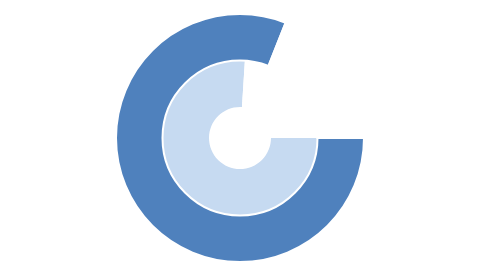
| Category | Series 1 | Series 0 |
|---|---|---|
| 0 | 0.76 | 0.81 |
| 1 | 0.24 | 0.19 |